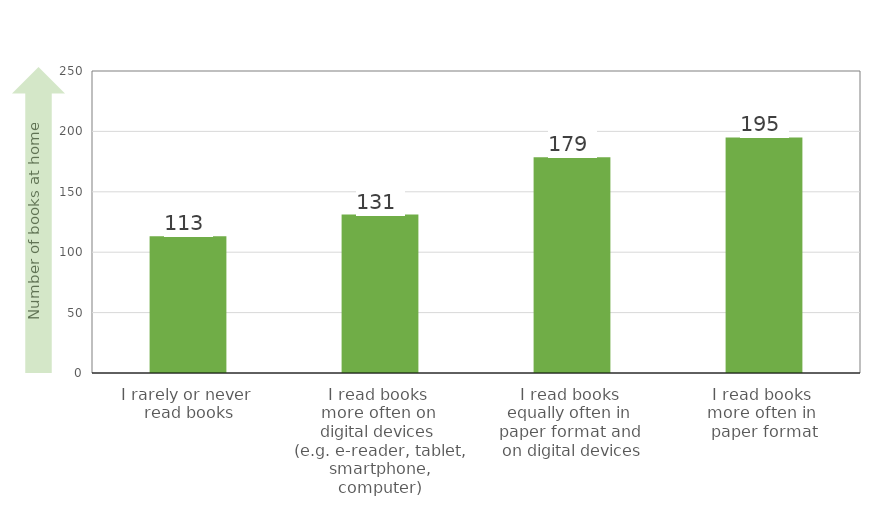
| Category | Number of books |
|---|---|
| I rarely or never 
read books | 113.208 |
| I read books 
more often on 
digital devices 
(e.g. e-reader, tablet, smartphone, computer) | 131.136 |
| I read books 
equally often in 
paper format and 
on digital devices | 178.685 |
| I read books 
more often in 
paper format | 194.986 |